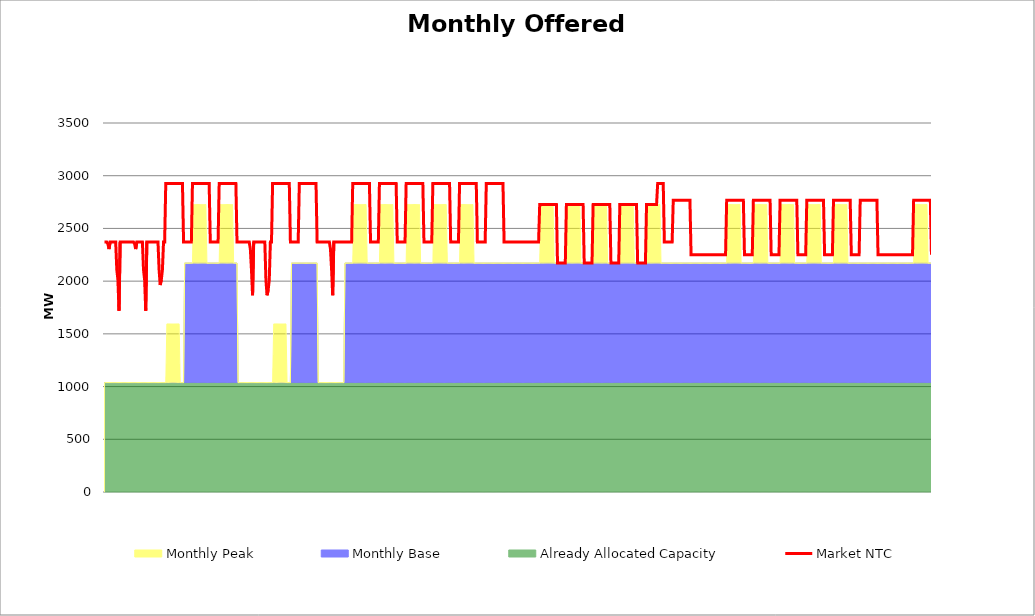
| Category | Market NTC |
|---|---|
| 0 | 2371 |
| 1 | 2371 |
| 2 | 2371 |
| 3 | 2353 |
| 4 | 2304 |
| 5 | 2371 |
| 6 | 2371 |
| 7 | 2371 |
| 8 | 2371 |
| 9 | 2371 |
| 10 | 2371 |
| 11 | 2109 |
| 12 | 2012 |
| 13 | 1720 |
| 14 | 2371 |
| 15 | 2371 |
| 16 | 2371 |
| 17 | 2371 |
| 18 | 2371 |
| 19 | 2371 |
| 20 | 2371 |
| 21 | 2371 |
| 22 | 2371 |
| 23 | 2371 |
| 24 | 2371 |
| 25 | 2371 |
| 26 | 2371 |
| 27 | 2353 |
| 28 | 2304 |
| 29 | 2371 |
| 30 | 2371 |
| 31 | 2371 |
| 32 | 2371 |
| 33 | 2371 |
| 34 | 2371 |
| 35 | 2109 |
| 36 | 2012 |
| 37 | 1720 |
| 38 | 2371 |
| 39 | 2371 |
| 40 | 2371 |
| 41 | 2371 |
| 42 | 2371 |
| 43 | 2371 |
| 44 | 2371 |
| 45 | 2371 |
| 46 | 2371 |
| 47 | 2371 |
| 48 | 2371 |
| 49 | 2109 |
| 50 | 1963 |
| 51 | 2012 |
| 52 | 2109 |
| 53 | 2371 |
| 54 | 2371 |
| 55 | 2927 |
| 56 | 2927 |
| 57 | 2927 |
| 58 | 2927 |
| 59 | 2927 |
| 60 | 2927 |
| 61 | 2927 |
| 62 | 2927 |
| 63 | 2927 |
| 64 | 2927 |
| 65 | 2927 |
| 66 | 2927 |
| 67 | 2927 |
| 68 | 2927 |
| 69 | 2927 |
| 70 | 2927 |
| 71 | 2371 |
| 72 | 2371 |
| 73 | 2371 |
| 74 | 2371 |
| 75 | 2371 |
| 76 | 2371 |
| 77 | 2371 |
| 78 | 2371 |
| 79 | 2927 |
| 80 | 2927 |
| 81 | 2927 |
| 82 | 2927 |
| 83 | 2927 |
| 84 | 2927 |
| 85 | 2927 |
| 86 | 2927 |
| 87 | 2927 |
| 88 | 2927 |
| 89 | 2927 |
| 90 | 2927 |
| 91 | 2927 |
| 92 | 2927 |
| 93 | 2927 |
| 94 | 2927 |
| 95 | 2371 |
| 96 | 2371 |
| 97 | 2371 |
| 98 | 2371 |
| 99 | 2371 |
| 100 | 2371 |
| 101 | 2371 |
| 102 | 2371 |
| 103 | 2927 |
| 104 | 2927 |
| 105 | 2927 |
| 106 | 2927 |
| 107 | 2927 |
| 108 | 2927 |
| 109 | 2927 |
| 110 | 2927 |
| 111 | 2927 |
| 112 | 2927 |
| 113 | 2927 |
| 114 | 2927 |
| 115 | 2927 |
| 116 | 2927 |
| 117 | 2927 |
| 118 | 2927 |
| 119 | 2371 |
| 120 | 2371 |
| 121 | 2371 |
| 122 | 2371 |
| 123 | 2371 |
| 124 | 2371 |
| 125 | 2371 |
| 126 | 2371 |
| 127 | 2371 |
| 128 | 2371 |
| 129 | 2371 |
| 130 | 2371 |
| 131 | 2304 |
| 132 | 2109 |
| 133 | 1866 |
| 134 | 2371 |
| 135 | 2371 |
| 136 | 2371 |
| 137 | 2371 |
| 138 | 2371 |
| 139 | 2371 |
| 140 | 2371 |
| 141 | 2371 |
| 142 | 2371 |
| 143 | 2371 |
| 144 | 2371 |
| 145 | 2012 |
| 146 | 1866 |
| 147 | 1915 |
| 148 | 2012 |
| 149 | 2371 |
| 150 | 2371 |
| 151 | 2927 |
| 152 | 2927 |
| 153 | 2927 |
| 154 | 2927 |
| 155 | 2927 |
| 156 | 2927 |
| 157 | 2927 |
| 158 | 2927 |
| 159 | 2927 |
| 160 | 2927 |
| 161 | 2927 |
| 162 | 2927 |
| 163 | 2927 |
| 164 | 2927 |
| 165 | 2927 |
| 166 | 2927 |
| 167 | 2371 |
| 168 | 2371 |
| 169 | 2371 |
| 170 | 2371 |
| 171 | 2371 |
| 172 | 2371 |
| 173 | 2371 |
| 174 | 2371 |
| 175 | 2927 |
| 176 | 2927 |
| 177 | 2927 |
| 178 | 2927 |
| 179 | 2927 |
| 180 | 2927 |
| 181 | 2927 |
| 182 | 2927 |
| 183 | 2927 |
| 184 | 2927 |
| 185 | 2927 |
| 186 | 2927 |
| 187 | 2927 |
| 188 | 2927 |
| 189 | 2927 |
| 190 | 2927 |
| 191 | 2371 |
| 192 | 2371 |
| 193 | 2371 |
| 194 | 2371 |
| 195 | 2371 |
| 196 | 2371 |
| 197 | 2371 |
| 198 | 2371 |
| 199 | 2371 |
| 200 | 2371 |
| 201 | 2371 |
| 202 | 2371 |
| 203 | 2304 |
| 204 | 2109 |
| 205 | 1866 |
| 206 | 2371 |
| 207 | 2371 |
| 208 | 2371 |
| 209 | 2371 |
| 210 | 2371 |
| 211 | 2371 |
| 212 | 2371 |
| 213 | 2371 |
| 214 | 2371 |
| 215 | 2371 |
| 216 | 2371 |
| 217 | 2371 |
| 218 | 2371 |
| 219 | 2371 |
| 220 | 2371 |
| 221 | 2371 |
| 222 | 2371 |
| 223 | 2927 |
| 224 | 2927 |
| 225 | 2927 |
| 226 | 2927 |
| 227 | 2927 |
| 228 | 2927 |
| 229 | 2927 |
| 230 | 2927 |
| 231 | 2927 |
| 232 | 2927 |
| 233 | 2927 |
| 234 | 2927 |
| 235 | 2927 |
| 236 | 2927 |
| 237 | 2927 |
| 238 | 2927 |
| 239 | 2371 |
| 240 | 2371 |
| 241 | 2371 |
| 242 | 2371 |
| 243 | 2371 |
| 244 | 2371 |
| 245 | 2371 |
| 246 | 2371 |
| 247 | 2927 |
| 248 | 2927 |
| 249 | 2927 |
| 250 | 2927 |
| 251 | 2927 |
| 252 | 2927 |
| 253 | 2927 |
| 254 | 2927 |
| 255 | 2927 |
| 256 | 2927 |
| 257 | 2927 |
| 258 | 2927 |
| 259 | 2927 |
| 260 | 2927 |
| 261 | 2927 |
| 262 | 2927 |
| 263 | 2371 |
| 264 | 2371 |
| 265 | 2371 |
| 266 | 2371 |
| 267 | 2371 |
| 268 | 2371 |
| 269 | 2371 |
| 270 | 2371 |
| 271 | 2927 |
| 272 | 2927 |
| 273 | 2927 |
| 274 | 2927 |
| 275 | 2927 |
| 276 | 2927 |
| 277 | 2927 |
| 278 | 2927 |
| 279 | 2927 |
| 280 | 2927 |
| 281 | 2927 |
| 282 | 2927 |
| 283 | 2927 |
| 284 | 2927 |
| 285 | 2927 |
| 286 | 2927 |
| 287 | 2371 |
| 288 | 2371 |
| 289 | 2371 |
| 290 | 2371 |
| 291 | 2371 |
| 292 | 2371 |
| 293 | 2371 |
| 294 | 2371 |
| 295 | 2927 |
| 296 | 2927 |
| 297 | 2927 |
| 298 | 2927 |
| 299 | 2927 |
| 300 | 2927 |
| 301 | 2927 |
| 302 | 2927 |
| 303 | 2927 |
| 304 | 2927 |
| 305 | 2927 |
| 306 | 2927 |
| 307 | 2927 |
| 308 | 2927 |
| 309 | 2927 |
| 310 | 2927 |
| 311 | 2371 |
| 312 | 2371 |
| 313 | 2371 |
| 314 | 2371 |
| 315 | 2371 |
| 316 | 2371 |
| 317 | 2371 |
| 318 | 2371 |
| 319 | 2927 |
| 320 | 2927 |
| 321 | 2927 |
| 322 | 2927 |
| 323 | 2927 |
| 324 | 2927 |
| 325 | 2927 |
| 326 | 2927 |
| 327 | 2927 |
| 328 | 2927 |
| 329 | 2927 |
| 330 | 2927 |
| 331 | 2927 |
| 332 | 2927 |
| 333 | 2927 |
| 334 | 2927 |
| 335 | 2371 |
| 336 | 2371 |
| 337 | 2371 |
| 338 | 2371 |
| 339 | 2371 |
| 340 | 2371 |
| 341 | 2371 |
| 342 | 2371 |
| 343 | 2927 |
| 344 | 2927 |
| 345 | 2927 |
| 346 | 2927 |
| 347 | 2927 |
| 348 | 2927 |
| 349 | 2927 |
| 350 | 2927 |
| 351 | 2927 |
| 352 | 2927 |
| 353 | 2927 |
| 354 | 2927 |
| 355 | 2927 |
| 356 | 2927 |
| 357 | 2927 |
| 358 | 2927 |
| 359 | 2371 |
| 360 | 2371 |
| 361 | 2371 |
| 362 | 2371 |
| 363 | 2371 |
| 364 | 2371 |
| 365 | 2371 |
| 366 | 2371 |
| 367 | 2371 |
| 368 | 2371 |
| 369 | 2371 |
| 370 | 2371 |
| 371 | 2371 |
| 372 | 2371 |
| 373 | 2371 |
| 374 | 2371 |
| 375 | 2371 |
| 376 | 2371 |
| 377 | 2371 |
| 378 | 2371 |
| 379 | 2371 |
| 380 | 2371 |
| 381 | 2371 |
| 382 | 2371 |
| 383 | 2371 |
| 384 | 2371 |
| 385 | 2371 |
| 386 | 2371 |
| 387 | 2371 |
| 388 | 2371 |
| 389 | 2371 |
| 390 | 2371 |
| 391 | 2727 |
| 392 | 2727 |
| 393 | 2727 |
| 394 | 2727 |
| 395 | 2727 |
| 396 | 2727 |
| 397 | 2727 |
| 398 | 2727 |
| 399 | 2727 |
| 400 | 2727 |
| 401 | 2727 |
| 402 | 2727 |
| 403 | 2727 |
| 404 | 2727 |
| 405 | 2727 |
| 406 | 2727 |
| 407 | 2171 |
| 408 | 2171 |
| 409 | 2171 |
| 410 | 2171 |
| 411 | 2171 |
| 412 | 2171 |
| 413 | 2171 |
| 414 | 2171 |
| 415 | 2727 |
| 416 | 2727 |
| 417 | 2727 |
| 418 | 2727 |
| 419 | 2727 |
| 420 | 2727 |
| 421 | 2727 |
| 422 | 2727 |
| 423 | 2727 |
| 424 | 2727 |
| 425 | 2727 |
| 426 | 2727 |
| 427 | 2727 |
| 428 | 2727 |
| 429 | 2727 |
| 430 | 2727 |
| 431 | 2171 |
| 432 | 2171 |
| 433 | 2171 |
| 434 | 2171 |
| 435 | 2171 |
| 436 | 2171 |
| 437 | 2171 |
| 438 | 2171 |
| 439 | 2727 |
| 440 | 2727 |
| 441 | 2727 |
| 442 | 2727 |
| 443 | 2727 |
| 444 | 2727 |
| 445 | 2727 |
| 446 | 2727 |
| 447 | 2727 |
| 448 | 2727 |
| 449 | 2727 |
| 450 | 2727 |
| 451 | 2727 |
| 452 | 2727 |
| 453 | 2727 |
| 454 | 2727 |
| 455 | 2171 |
| 456 | 2171 |
| 457 | 2171 |
| 458 | 2171 |
| 459 | 2171 |
| 460 | 2171 |
| 461 | 2171 |
| 462 | 2171 |
| 463 | 2727 |
| 464 | 2727 |
| 465 | 2727 |
| 466 | 2727 |
| 467 | 2727 |
| 468 | 2727 |
| 469 | 2727 |
| 470 | 2727 |
| 471 | 2727 |
| 472 | 2727 |
| 473 | 2727 |
| 474 | 2727 |
| 475 | 2727 |
| 476 | 2727 |
| 477 | 2727 |
| 478 | 2727 |
| 479 | 2171 |
| 480 | 2171 |
| 481 | 2171 |
| 482 | 2171 |
| 483 | 2171 |
| 484 | 2171 |
| 485 | 2171 |
| 486 | 2171 |
| 487 | 2727 |
| 488 | 2727 |
| 489 | 2727 |
| 490 | 2727 |
| 491 | 2727 |
| 492 | 2727 |
| 493 | 2727 |
| 494 | 2727 |
| 495 | 2727 |
| 496 | 2727 |
| 497 | 2927 |
| 498 | 2927 |
| 499 | 2927 |
| 500 | 2927 |
| 501 | 2927 |
| 502 | 2927 |
| 503 | 2371 |
| 504 | 2371 |
| 505 | 2371 |
| 506 | 2371 |
| 507 | 2371 |
| 508 | 2371 |
| 509 | 2371 |
| 510 | 2371 |
| 511 | 2767 |
| 512 | 2767 |
| 513 | 2767 |
| 514 | 2767 |
| 515 | 2767 |
| 516 | 2767 |
| 517 | 2767 |
| 518 | 2767 |
| 519 | 2767 |
| 520 | 2767 |
| 521 | 2767 |
| 522 | 2767 |
| 523 | 2767 |
| 524 | 2767 |
| 525 | 2767 |
| 526 | 2767 |
| 527 | 2251 |
| 528 | 2251 |
| 529 | 2251 |
| 530 | 2251 |
| 531 | 2251 |
| 532 | 2251 |
| 533 | 2251 |
| 534 | 2251 |
| 535 | 2251 |
| 536 | 2251 |
| 537 | 2251 |
| 538 | 2251 |
| 539 | 2251 |
| 540 | 2251 |
| 541 | 2251 |
| 542 | 2251 |
| 543 | 2251 |
| 544 | 2251 |
| 545 | 2251 |
| 546 | 2251 |
| 547 | 2251 |
| 548 | 2251 |
| 549 | 2251 |
| 550 | 2251 |
| 551 | 2251 |
| 552 | 2251 |
| 553 | 2251 |
| 554 | 2251 |
| 555 | 2251 |
| 556 | 2251 |
| 557 | 2251 |
| 558 | 2251 |
| 559 | 2767 |
| 560 | 2767 |
| 561 | 2767 |
| 562 | 2767 |
| 563 | 2767 |
| 564 | 2767 |
| 565 | 2767 |
| 566 | 2767 |
| 567 | 2767 |
| 568 | 2767 |
| 569 | 2767 |
| 570 | 2767 |
| 571 | 2767 |
| 572 | 2767 |
| 573 | 2767 |
| 574 | 2767 |
| 575 | 2251 |
| 576 | 2251 |
| 577 | 2251 |
| 578 | 2251 |
| 579 | 2251 |
| 580 | 2251 |
| 581 | 2251 |
| 582 | 2251 |
| 583 | 2767 |
| 584 | 2767 |
| 585 | 2767 |
| 586 | 2767 |
| 587 | 2767 |
| 588 | 2767 |
| 589 | 2767 |
| 590 | 2767 |
| 591 | 2767 |
| 592 | 2767 |
| 593 | 2767 |
| 594 | 2767 |
| 595 | 2767 |
| 596 | 2767 |
| 597 | 2767 |
| 598 | 2767 |
| 599 | 2251 |
| 600 | 2251 |
| 601 | 2251 |
| 602 | 2251 |
| 603 | 2251 |
| 604 | 2251 |
| 605 | 2251 |
| 606 | 2251 |
| 607 | 2767 |
| 608 | 2767 |
| 609 | 2767 |
| 610 | 2767 |
| 611 | 2767 |
| 612 | 2767 |
| 613 | 2767 |
| 614 | 2767 |
| 615 | 2767 |
| 616 | 2767 |
| 617 | 2767 |
| 618 | 2767 |
| 619 | 2767 |
| 620 | 2767 |
| 621 | 2767 |
| 622 | 2767 |
| 623 | 2251 |
| 624 | 2251 |
| 625 | 2251 |
| 626 | 2251 |
| 627 | 2251 |
| 628 | 2251 |
| 629 | 2251 |
| 630 | 2251 |
| 631 | 2767 |
| 632 | 2767 |
| 633 | 2767 |
| 634 | 2767 |
| 635 | 2767 |
| 636 | 2767 |
| 637 | 2767 |
| 638 | 2767 |
| 639 | 2767 |
| 640 | 2767 |
| 641 | 2767 |
| 642 | 2767 |
| 643 | 2767 |
| 644 | 2767 |
| 645 | 2767 |
| 646 | 2767 |
| 647 | 2251 |
| 648 | 2251 |
| 649 | 2251 |
| 650 | 2251 |
| 651 | 2251 |
| 652 | 2251 |
| 653 | 2251 |
| 654 | 2251 |
| 655 | 2767 |
| 656 | 2767 |
| 657 | 2767 |
| 658 | 2767 |
| 659 | 2767 |
| 660 | 2767 |
| 661 | 2767 |
| 662 | 2767 |
| 663 | 2767 |
| 664 | 2767 |
| 665 | 2767 |
| 666 | 2767 |
| 667 | 2767 |
| 668 | 2767 |
| 669 | 2767 |
| 670 | 2767 |
| 671 | 2251 |
| 672 | 2251 |
| 673 | 2251 |
| 674 | 2251 |
| 675 | 2251 |
| 676 | 2251 |
| 677 | 2251 |
| 678 | 2251 |
| 679 | 2767 |
| 680 | 2767 |
| 681 | 2767 |
| 682 | 2767 |
| 683 | 2767 |
| 684 | 2767 |
| 685 | 2767 |
| 686 | 2767 |
| 687 | 2767 |
| 688 | 2767 |
| 689 | 2767 |
| 690 | 2767 |
| 691 | 2767 |
| 692 | 2767 |
| 693 | 2767 |
| 694 | 2767 |
| 695 | 2251 |
| 696 | 2251 |
| 697 | 2251 |
| 698 | 2251 |
| 699 | 2251 |
| 700 | 2251 |
| 701 | 2251 |
| 702 | 2251 |
| 703 | 2251 |
| 704 | 2251 |
| 705 | 2251 |
| 706 | 2251 |
| 707 | 2251 |
| 708 | 2251 |
| 709 | 2251 |
| 710 | 2251 |
| 711 | 2251 |
| 712 | 2251 |
| 713 | 2251 |
| 714 | 2251 |
| 715 | 2251 |
| 716 | 2251 |
| 717 | 2251 |
| 718 | 2251 |
| 719 | 2251 |
| 720 | 2251 |
| 721 | 2251 |
| 722 | 2251 |
| 723 | 2251 |
| 724 | 2251 |
| 725 | 2251 |
| 726 | 2251 |
| 727 | 2767 |
| 728 | 2767 |
| 729 | 2767 |
| 730 | 2767 |
| 731 | 2767 |
| 732 | 2767 |
| 733 | 2767 |
| 734 | 2767 |
| 735 | 2767 |
| 736 | 2767 |
| 737 | 2767 |
| 738 | 2767 |
| 739 | 2767 |
| 740 | 2767 |
| 741 | 2767 |
| 742 | 2767 |
| 743 | 2251 |